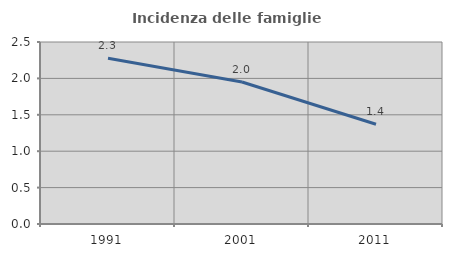
| Category | Incidenza delle famiglie numerose |
|---|---|
| 1991.0 | 2.278 |
| 2001.0 | 1.951 |
| 2011.0 | 1.37 |